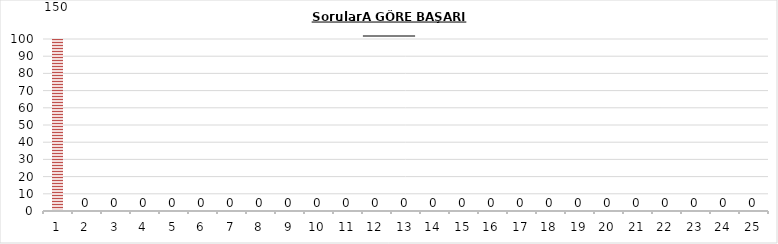
| Category | Series 0 |
|---|---|
| 0 | 150 |
| 1 | 0 |
| 2 | 0 |
| 3 | 0 |
| 4 | 0 |
| 5 | 0 |
| 6 | 0 |
| 7 | 0 |
| 8 | 0 |
| 9 | 0 |
| 10 | 0 |
| 11 | 0 |
| 12 | 0 |
| 13 | 0 |
| 14 | 0 |
| 15 | 0 |
| 16 | 0 |
| 17 | 0 |
| 18 | 0 |
| 19 | 0 |
| 20 | 0 |
| 21 | 0 |
| 22 | 0 |
| 23 | 0 |
| 24 | 0 |